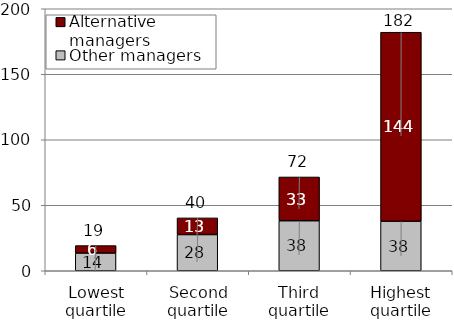
| Category | Other managers | Alternative managers |
|---|---|---|
| Lowest quartile | 13.528 | 5.667 |
| Second quartile | 27.647 | 12.706 |
| Third quartile | 38.2 | 33.4 |
| Highest quartile | 37.794 | 144.294 |